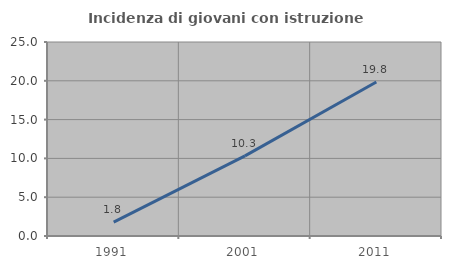
| Category | Incidenza di giovani con istruzione universitaria |
|---|---|
| 1991.0 | 1.786 |
| 2001.0 | 10.323 |
| 2011.0 | 19.841 |